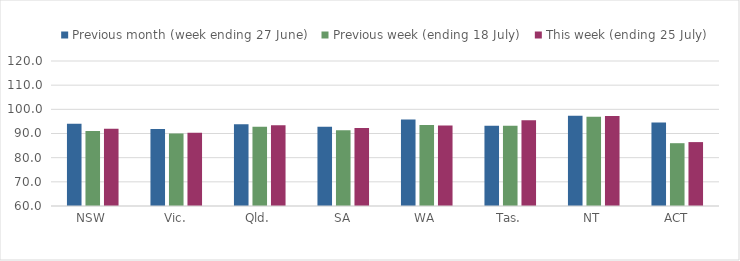
| Category | Previous month (week ending 27 June) | Previous week (ending 18 July) | This week (ending 25 July) |
|---|---|---|---|
| NSW | 94.024 | 91.077 | 91.938 |
| Vic. | 91.872 | 90.041 | 90.326 |
| Qld. | 93.879 | 92.763 | 93.42 |
| SA | 92.822 | 91.338 | 92.292 |
| WA | 95.756 | 93.54 | 93.342 |
| Tas. | 93.194 | 93.194 | 95.45 |
| NT | 97.342 | 96.899 | 97.256 |
| ACT | 94.576 | 85.989 | 86.441 |